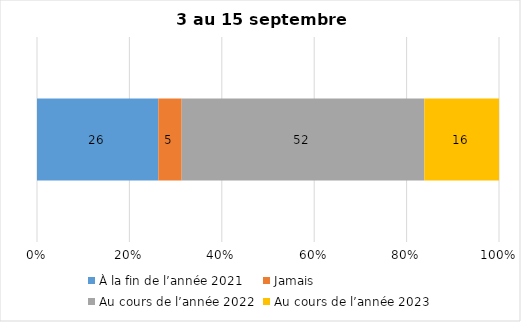
| Category | À la fin de l’année 2021 | Jamais | Au cours de l’année 2022 | Au cours de l’année 2023 |
|---|---|---|---|---|
| 0 | 26 | 5 | 52 | 16 |